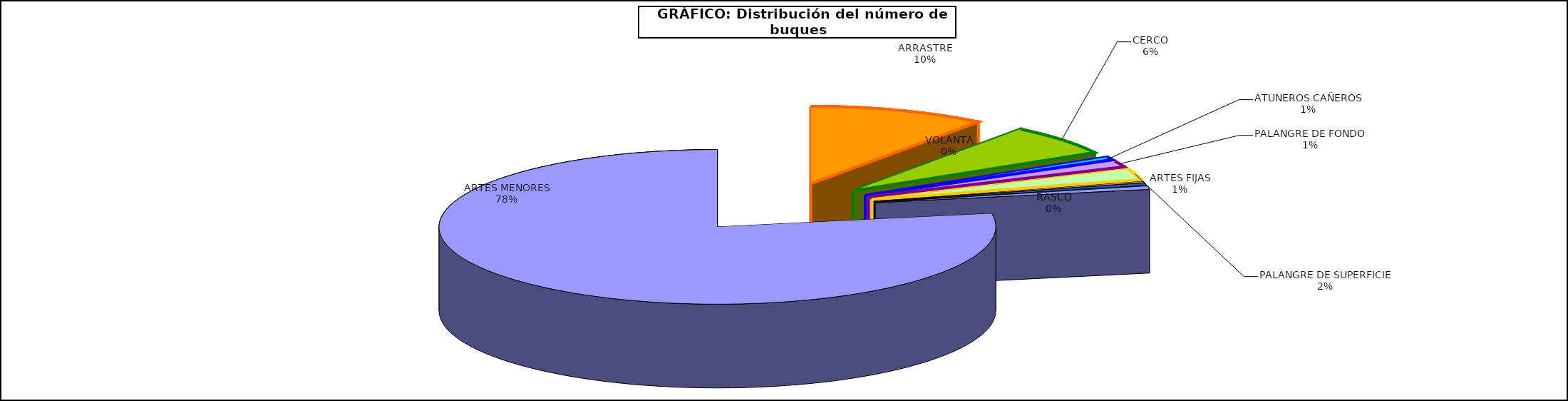
| Category | Series 0 |
|---|---|
| ARRASTRE | 922 |
| CERCO | 579 |
| ATUNEROS CAÑEROS | 55 |
| PALANGRE DE FONDO | 116 |
| PALANGRE DE SUPERFICIE | 200 |
| RASCO | 23 |
| VOLANTA | 40 |
| ARTES FIJAS | 60 |
| ARTES MENORES | 6977 |